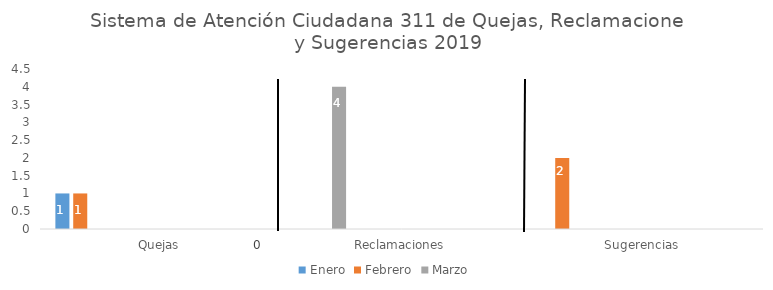
| Category | Enero | Febrero | Marzo | Abril | Mayo | Junio | Julio | Agosto | Septiembre | Octubre | Noviembre | Diciembre |
|---|---|---|---|---|---|---|---|---|---|---|---|---|
| Quejas | 1 | 1 | 0 | 0 | 0 | 0 | 0 | 0 | 0 | 0 | 0 | 0 |
| Reclamaciones | 0 | 0 | 4 | 0 | 0 | 0 | 0 | 0 | 0 | 0 | 0 | 0 |
| Sugerencias | 0 | 2 | 0 | 0 | 0 | 0 | 0 | 0 | 0 | 0 | 0 | 0 |